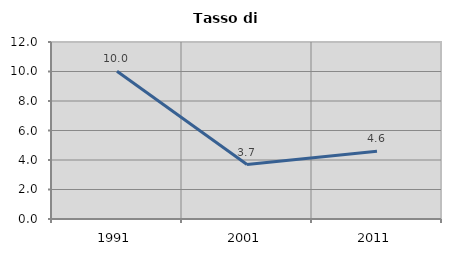
| Category | Tasso di disoccupazione   |
|---|---|
| 1991.0 | 10.015 |
| 2001.0 | 3.691 |
| 2011.0 | 4.592 |